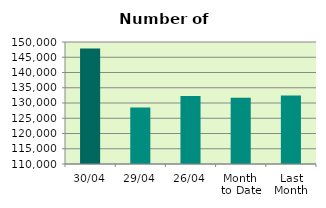
| Category | Series 0 |
|---|---|
| 30/04 | 147852 |
| 29/04 | 128538 |
| 26/04 | 132280 |
| Month 
to Date | 131708.5 |
| Last
Month | 132498.571 |